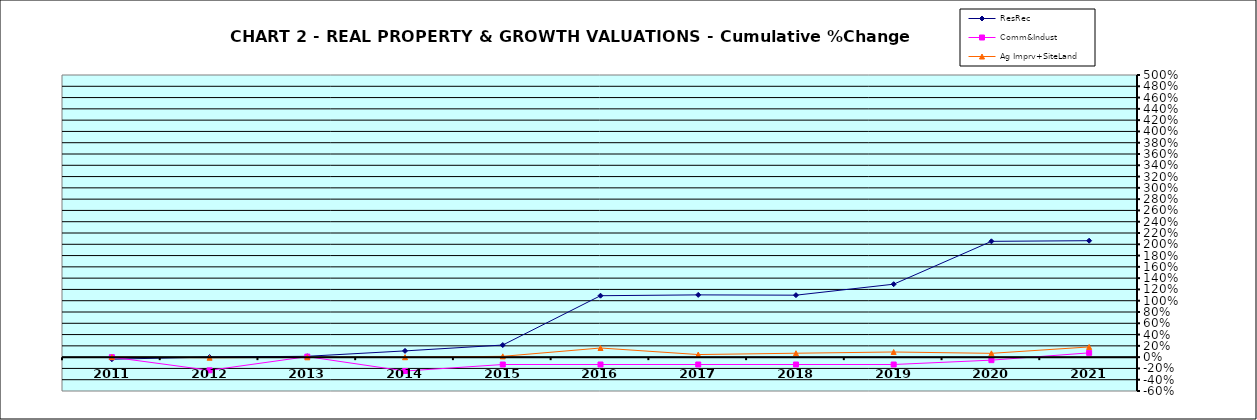
| Category | ResRec | Comm&Indust | Ag Imprv+SiteLand |
|---|---|---|---|
| 2011.0 | -0.037 | 0 | 0 |
| 2012.0 | 0.001 | -0.233 | -0.011 |
| 2013.0 | 0.015 | 0.009 | -0.003 |
| 2014.0 | 0.111 | -0.246 | -0.001 |
| 2015.0 | 0.215 | -0.13 | 0.014 |
| 2016.0 | 1.089 | -0.13 | 0.162 |
| 2017.0 | 1.103 | -0.13 | 0.046 |
| 2018.0 | 1.098 | -0.131 | 0.069 |
| 2019.0 | 1.293 | -0.131 | 0.091 |
| 2020.0 | 2.052 | -0.053 | 0.067 |
| 2021.0 | 2.064 | 0.076 | 0.181 |